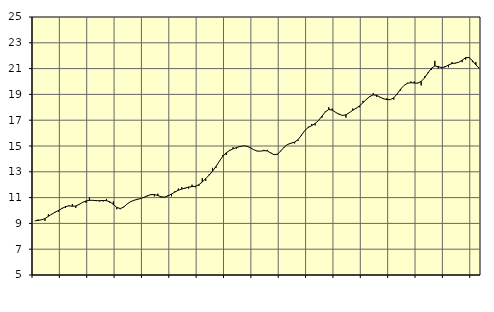
| Category | Piggar | Finansiell verksamhet, företagstjänster, SNI 64-82 |
|---|---|---|
| nan | 9.2 | 9.2 |
| 87.0 | 9.3 | 9.23 |
| 87.0 | 9.3 | 9.28 |
| 87.0 | 9.2 | 9.37 |
| nan | 9.7 | 9.55 |
| 88.0 | 9.7 | 9.72 |
| 88.0 | 9.9 | 9.87 |
| 88.0 | 9.9 | 10.01 |
| nan | 10.2 | 10.16 |
| 89.0 | 10.2 | 10.3 |
| 89.0 | 10.4 | 10.36 |
| 89.0 | 10.5 | 10.33 |
| nan | 10.2 | 10.35 |
| 90.0 | 10.5 | 10.47 |
| 90.0 | 10.6 | 10.63 |
| 90.0 | 10.6 | 10.74 |
| nan | 11 | 10.79 |
| 91.0 | 10.8 | 10.79 |
| 91.0 | 10.8 | 10.76 |
| 91.0 | 10.7 | 10.76 |
| nan | 10.7 | 10.78 |
| 92.0 | 10.9 | 10.76 |
| 92.0 | 10.6 | 10.67 |
| 92.0 | 10.7 | 10.47 |
| nan | 10.1 | 10.24 |
| 93.0 | 10.1 | 10.15 |
| 93.0 | 10.3 | 10.26 |
| 93.0 | 10.5 | 10.5 |
| nan | 10.7 | 10.68 |
| 94.0 | 10.8 | 10.79 |
| 94.0 | 10.9 | 10.86 |
| 94.0 | 10.9 | 10.93 |
| nan | 11 | 11.03 |
| 95.0 | 11.1 | 11.15 |
| 95.0 | 11.2 | 11.23 |
| 95.0 | 11.1 | 11.24 |
| nan | 11.3 | 11.16 |
| 96.0 | 11 | 11.06 |
| 96.0 | 11 | 11.04 |
| 96.0 | 11.2 | 11.13 |
| nan | 11.1 | 11.28 |
| 97.0 | 11.5 | 11.43 |
| 97.0 | 11.7 | 11.57 |
| 97.0 | 11.8 | 11.66 |
| nan | 11.7 | 11.74 |
| 98.0 | 11.7 | 11.82 |
| 98.0 | 12 | 11.85 |
| 98.0 | 11.8 | 11.88 |
| nan | 11.9 | 12 |
| 99.0 | 12.5 | 12.21 |
| 99.0 | 12.3 | 12.47 |
| 99.0 | 12.8 | 12.74 |
| nan | 13.3 | 13.05 |
| 0.0 | 13.3 | 13.41 |
| 0.0 | 13.8 | 13.82 |
| 0.0 | 14.3 | 14.2 |
| nan | 14.3 | 14.47 |
| 1.0 | 14.7 | 14.65 |
| 1.0 | 14.9 | 14.78 |
| 1.0 | 14.8 | 14.88 |
| nan | 15 | 14.96 |
| 2.0 | 15 | 15.01 |
| 2.0 | 15 | 14.99 |
| 2.0 | 14.9 | 14.87 |
| nan | 14.7 | 14.72 |
| 3.0 | 14.6 | 14.61 |
| 3.0 | 14.6 | 14.6 |
| 3.0 | 14.7 | 14.64 |
| nan | 14.7 | 14.62 |
| 4.0 | 14.5 | 14.46 |
| 4.0 | 14.3 | 14.33 |
| 4.0 | 14.3 | 14.37 |
| nan | 14.6 | 14.63 |
| 5.0 | 14.9 | 14.93 |
| 5.0 | 15.1 | 15.13 |
| 5.0 | 15.2 | 15.22 |
| nan | 15.2 | 15.3 |
| 6.0 | 15.4 | 15.49 |
| 6.0 | 15.8 | 15.84 |
| 6.0 | 16.2 | 16.21 |
| nan | 16.5 | 16.44 |
| 7.0 | 16.7 | 16.58 |
| 7.0 | 16.6 | 16.74 |
| 7.0 | 17 | 16.98 |
| nan | 17.2 | 17.32 |
| 8.0 | 17.7 | 17.65 |
| 8.0 | 18 | 17.83 |
| 8.0 | 17.9 | 17.78 |
| nan | 17.6 | 17.61 |
| 9.0 | 17.5 | 17.46 |
| 9.0 | 17.4 | 17.37 |
| 9.0 | 17.2 | 17.42 |
| nan | 17.6 | 17.58 |
| 10.0 | 17.9 | 17.77 |
| 10.0 | 17.9 | 17.93 |
| 10.0 | 18 | 18.11 |
| nan | 18.5 | 18.36 |
| 11.0 | 18.6 | 18.62 |
| 11.0 | 18.8 | 18.84 |
| 11.0 | 19.1 | 18.96 |
| nan | 18.8 | 18.93 |
| 12.0 | 18.8 | 18.78 |
| 12.0 | 18.7 | 18.66 |
| 12.0 | 18.7 | 18.6 |
| nan | 18.6 | 18.59 |
| 13.0 | 18.6 | 18.74 |
| 13.0 | 19 | 19.04 |
| 13.0 | 19.3 | 19.41 |
| nan | 19.7 | 19.7 |
| 14.0 | 19.9 | 19.86 |
| 14.0 | 20 | 19.91 |
| 14.0 | 20 | 19.88 |
| nan | 19.9 | 19.87 |
| 15.0 | 19.7 | 20.01 |
| 15.0 | 20.4 | 20.28 |
| 15.0 | 20.7 | 20.66 |
| nan | 20.9 | 21.03 |
| 16.0 | 21.6 | 21.2 |
| 16.0 | 21 | 21.16 |
| 16.0 | 21 | 21.08 |
| nan | 21.2 | 21.13 |
| 17.0 | 21.1 | 21.28 |
| 17.0 | 21.5 | 21.39 |
| 17.0 | 21.4 | 21.43 |
| nan | 21.5 | 21.49 |
| 18.0 | 21.5 | 21.65 |
| 18.0 | 21.7 | 21.85 |
| 18.0 | 21.9 | 21.86 |
| nan | 21.5 | 21.62 |
| 19.0 | 21.5 | 21.28 |
| 19.0 | 21 | 21.03 |